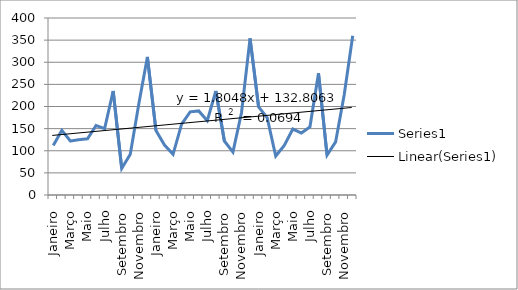
| Category | Series 0 |
|---|---|
| Janeiro | 112 |
| Fevereiro | 146 |
| Março | 122 |
| Abril | 125 |
| Maio | 127 |
| Junho | 157 |
| Julho | 150 |
| Agosto | 235 |
| Setembro | 60 |
| Outubro | 92 |
| Novembro | 206 |
| Dezembro | 312 |
| Janeiro | 146 |
| Fevereiro | 113 |
| Março | 92 |
| Abril | 160 |
| Maio | 188 |
| Junho | 190 |
| Julho | 168 |
| Agosto | 235 |
| Setembro | 122 |
| Outubro | 97 |
| Novembro | 186 |
| Dezembro | 354 |
| Janeiro | 199 |
| Fevereiro | 175 |
| Março | 88 |
| Abril | 112 |
| Maio | 149 |
| Junho | 140 |
| Julho | 154 |
| Agosto | 275 |
| Setembro | 90 |
| Outubro | 120 |
| Novembro | 226 |
| Dezembro | 360 |